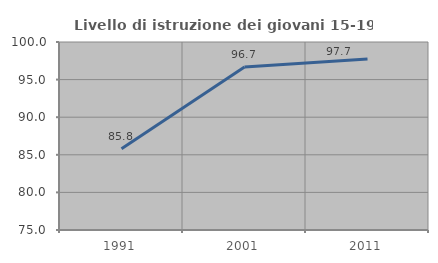
| Category | Livello di istruzione dei giovani 15-19 anni |
|---|---|
| 1991.0 | 85.802 |
| 2001.0 | 96.678 |
| 2011.0 | 97.744 |